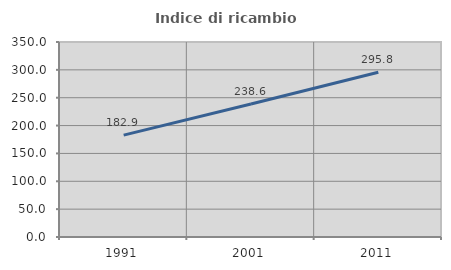
| Category | Indice di ricambio occupazionale  |
|---|---|
| 1991.0 | 182.927 |
| 2001.0 | 238.596 |
| 2011.0 | 295.833 |